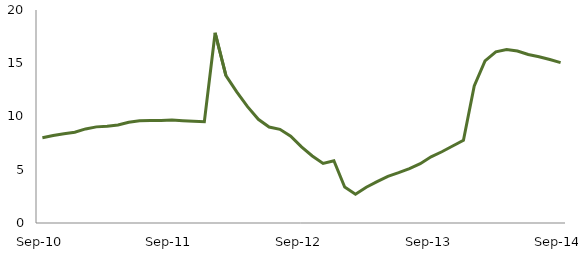
| Category | Series 0 |
|---|---|
| Sep-10 | 8.01 |
|  | 8.224 |
|  | 8.388 |
|  | 8.524 |
|  | 8.833 |
|  | 9.026 |
|  | 9.09 |
|  | 9.208 |
|  | 9.462 |
|  | 9.609 |
|  | 9.617 |
|  | 9.625 |
| Sep-11 | 9.681 |
|  | 9.607 |
|  | 9.549 |
|  | 9.507 |
|  | 17.862 |
|  | 13.836 |
|  | 12.306 |
|  | 10.924 |
|  | 9.737 |
|  | 9.012 |
|  | 8.798 |
|  | 8.145 |
| Sep-12 | 7.143 |
|  | 6.29 |
|  | 5.588 |
|  | 5.848 |
|  | 3.372 |
|  | 2.709 |
|  | 3.357 |
|  | 3.88 |
|  | 4.386 |
|  | 4.728 |
|  | 5.103 |
|  | 5.569 |
| Sep-13 | 6.219 |
|  | 6.691 |
|  | 7.233 |
|  | 7.764 |
|  | 12.871 |
|  | 15.229 |
|  | 16.075 |
|  | 16.29 |
|  | 16.142 |
|  | 15.823 |
|  | 15.617 |
|  | 15.35 |
| Sep-14 | 15.064 |